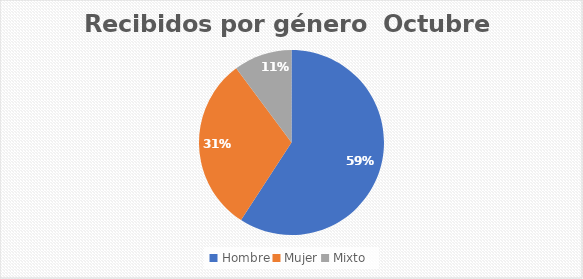
| Category | Recibidos por género  Octubre |
|---|---|
| Hombre | 29 |
| Mujer | 15 |
| Mixto | 5 |